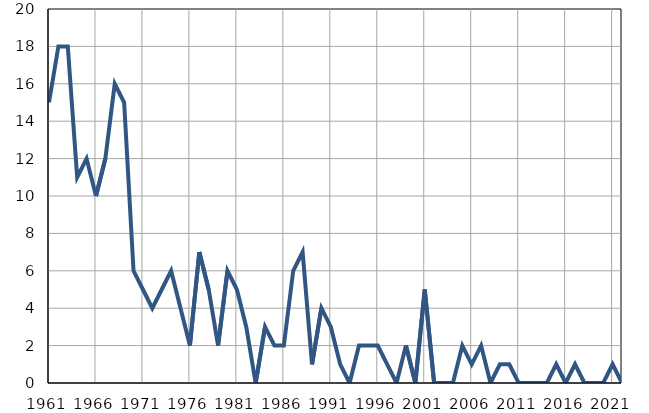
| Category | Умрла 
одојчад |
|---|---|
| 1961.0 | 15 |
| 1962.0 | 18 |
| 1963.0 | 18 |
| 1964.0 | 11 |
| 1965.0 | 12 |
| 1966.0 | 10 |
| 1967.0 | 12 |
| 1968.0 | 16 |
| 1969.0 | 15 |
| 1970.0 | 6 |
| 1971.0 | 5 |
| 1972.0 | 4 |
| 1973.0 | 5 |
| 1974.0 | 6 |
| 1975.0 | 4 |
| 1976.0 | 2 |
| 1977.0 | 7 |
| 1978.0 | 5 |
| 1979.0 | 2 |
| 1980.0 | 6 |
| 1981.0 | 5 |
| 1982.0 | 3 |
| 1983.0 | 0 |
| 1984.0 | 3 |
| 1985.0 | 2 |
| 1986.0 | 2 |
| 1987.0 | 6 |
| 1988.0 | 7 |
| 1989.0 | 1 |
| 1990.0 | 4 |
| 1991.0 | 3 |
| 1992.0 | 1 |
| 1993.0 | 0 |
| 1994.0 | 2 |
| 1995.0 | 2 |
| 1996.0 | 2 |
| 1997.0 | 1 |
| 1998.0 | 0 |
| 1999.0 | 2 |
| 2000.0 | 0 |
| 2001.0 | 5 |
| 2002.0 | 0 |
| 2003.0 | 0 |
| 2004.0 | 0 |
| 2005.0 | 2 |
| 2006.0 | 1 |
| 2007.0 | 2 |
| 2008.0 | 0 |
| 2009.0 | 1 |
| 2010.0 | 1 |
| 2011.0 | 0 |
| 2012.0 | 0 |
| 2013.0 | 0 |
| 2014.0 | 0 |
| 2015.0 | 1 |
| 2016.0 | 0 |
| 2017.0 | 1 |
| 2018.0 | 0 |
| 2019.0 | 0 |
| 2020.0 | 0 |
| 2021.0 | 1 |
| 2022.0 | 0 |